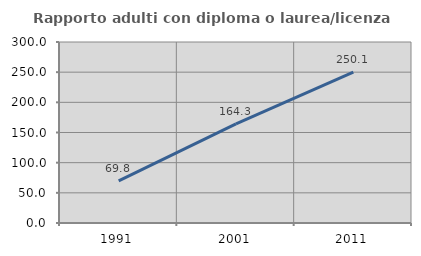
| Category | Rapporto adulti con diploma o laurea/licenza media  |
|---|---|
| 1991.0 | 69.832 |
| 2001.0 | 164.286 |
| 2011.0 | 250.117 |